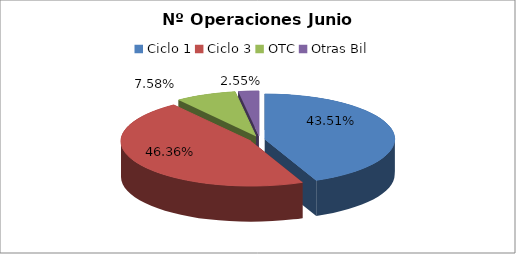
| Category | Series 0 |
|---|---|
| Ciclo 1 | 45225 |
| Ciclo 3 | 48182 |
| OTC | 7881 |
| Otras Bil | 2648 |